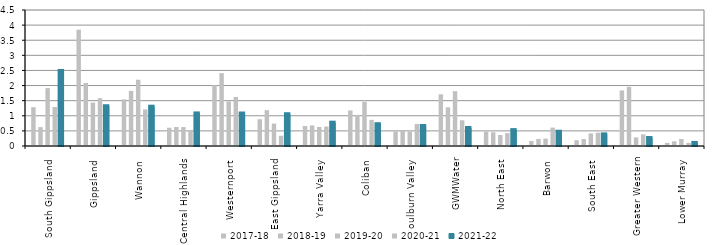
| Category | 2017-18 | 2018-19 | 2019-20 | 2020-21 | 2021-22 |
|---|---|---|---|---|---|
| South Gippsland  | 1.284 | 0.625 | 1.915 | 1.289 | 2.483 |
| Gippsland  | 3.849 | 2.084 | 1.436 | 1.581 | 1.315 |
| Wannon  | 1.542 | 1.824 | 2.194 | 1.211 | 1.3 |
| Central Highlands  | 0.605 | 0.63 | 0.626 | 0.516 | 1.078 |
| Westernport  | 2.011 | 2.411 | 1.472 | 1.623 | 1.075 |
| East Gippsland  | 0.885 | 1.187 | 0.743 | 0.34 | 1.052 |
| Yarra Valley  | 0.661 | 0.681 | 0.629 | 0.643 | 0.771 |
| Coliban  | 1.175 | 1.03 | 1.465 | 0.864 | 0.721 |
| Goulburn Valley  | 0.482 | 0.499 | 0.481 | 0.726 | 0.661 |
| GWMWater | 1.71 | 1.28 | 1.815 | 0.851 | 0.597 |
| North East  | 0.479 | 0.454 | 0.364 | 0.424 | 0.526 |
| Barwon  | 0.164 | 0.234 | 0.245 | 0.608 | 0.472 |
| South East  | 0.192 | 0.229 | 0.417 | 0.44 | 0.385 |
| Greater Western | 1.84 | 1.957 | 0.284 | 0.385 | 0.264 |
| Lower Murray  | 0.104 | 0.155 | 0.232 | 0.102 | 0.102 |